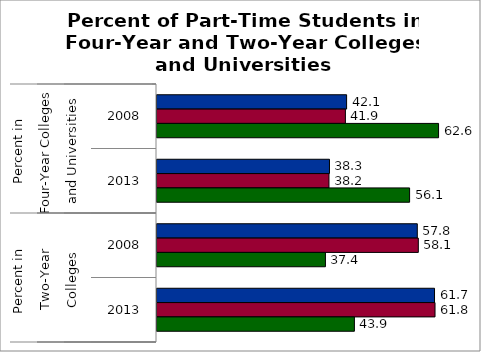
| Category | 50 states and D.C. | SREB states | State |
|---|---|---|---|
| 0 | 42.133 | 41.866 | 62.569 |
| 1 | 38.329 | 38.216 | 56.135 |
| 2 | 57.846 | 58.071 | 37.431 |
| 3 | 61.671 | 61.784 | 43.865 |